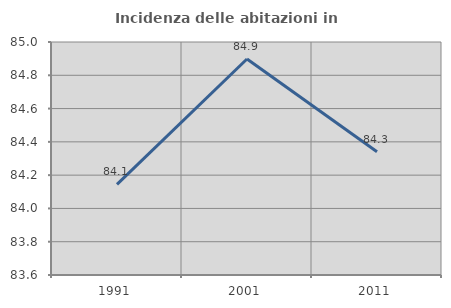
| Category | Incidenza delle abitazioni in proprietà  |
|---|---|
| 1991.0 | 84.144 |
| 2001.0 | 84.898 |
| 2011.0 | 84.34 |